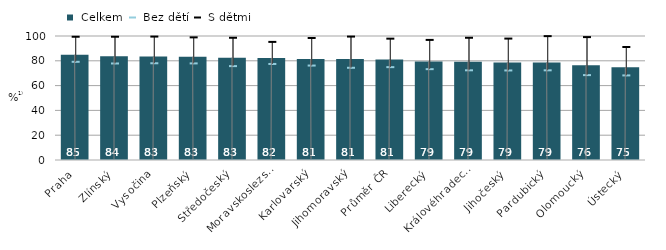
| Category |  Celkem |
|---|---|
| Praha | 84.877 |
| Zlínský | 83.589 |
| Vysočina | 83.371 |
| Plzeňský | 83.179 |
| Středočeský | 82.556 |
| Moravskoslezský | 82.271 |
| Karlovarský | 81.459 |
| Jihomoravský | 81.428 |
| Průměr ČR | 81.098 |
| Liberecký | 79.467 |
| Královéhradecký | 79.325 |
| Jihočeský | 78.64 |
| Pardubický | 78.606 |
| Olomoucký | 76.339 |
| Ústecký | 74.814 |